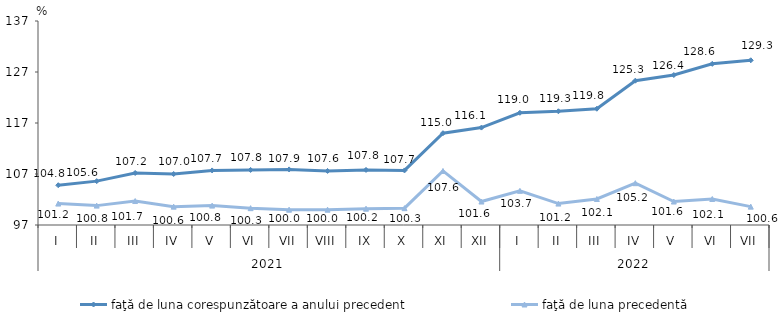
| Category | faţă de luna corespunzătoare a anului precedent | faţă de luna precedentă   |
|---|---|---|
| 0 | 104.8 | 101.2 |
| 1 | 105.6 | 100.8 |
| 2 | 107.2 | 101.7 |
| 3 | 107 | 100.6 |
| 4 | 107.7 | 100.8 |
| 5 | 107.8 | 100.3 |
| 6 | 107.9 | 100 |
| 7 | 107.6 | 100 |
| 8 | 107.8 | 100.2 |
| 9 | 107.7 | 100.3 |
| 10 | 115 | 107.6 |
| 11 | 116.1 | 101.6 |
| 12 | 119 | 103.7 |
| 13 | 119.3 | 101.2 |
| 14 | 119.8 | 102.1 |
| 15 | 125.3 | 105.2 |
| 16 | 126.4 | 101.6 |
| 17 | 128.6 | 102.1 |
| 18 | 129.3 | 100.6 |